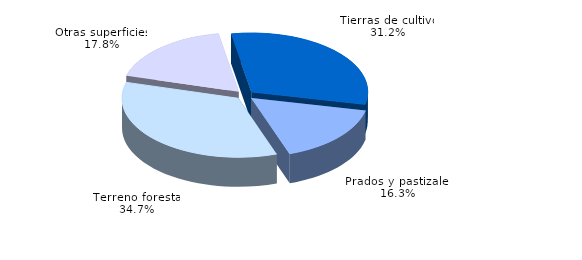
| Category | Series 0 |
|---|---|
| Tierras de cultivo | 157.24 |
| Prados y pastizales | 82.118 |
| Terreno forestal | 175.003 |
| Otras superficies | 90.026 |